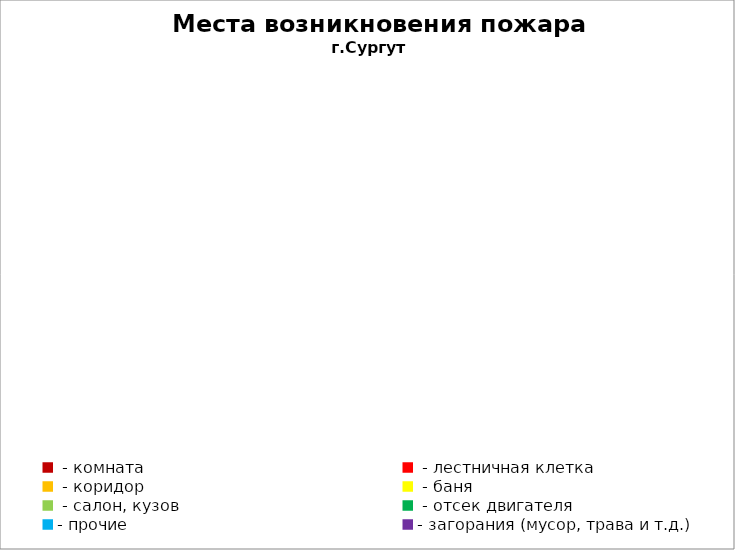
| Category | Места возникновения пожара |
|---|---|
|  - комната | 52 |
|  - лестничная клетка | 26 |
|  - коридор | 10 |
|  - баня | 28 |
|  - салон, кузов | 10 |
|  - отсек двигателя | 34 |
| - прочие | 136 |
| - загорания (мусор, трава и т.д.)  | 171 |